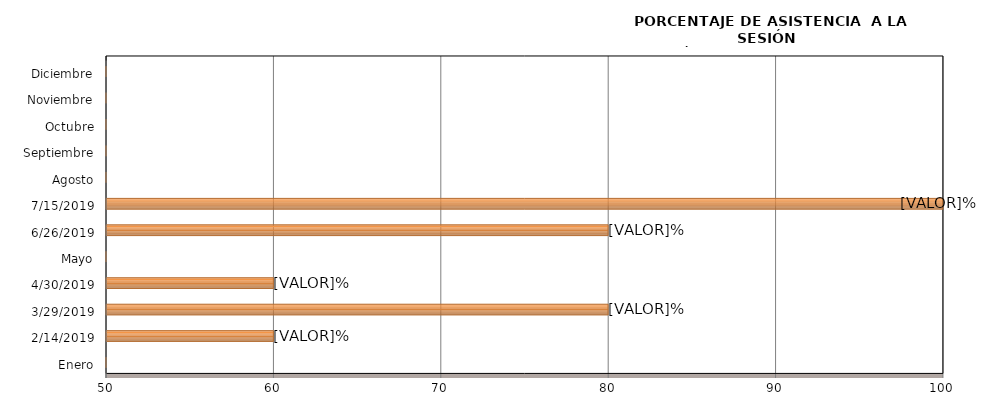
| Category | Series 0 |
|---|---|
| Enero | 0 |
| 14/02/2019 | 60 |
| 29/03/2019 | 80 |
| 30/04/2019 | 60 |
| Mayo | 0 |
| 26/06/2019 | 80 |
| 15/07/2019 | 100 |
| Agosto | 0 |
| Septiembre | 0 |
| Octubre | 0 |
| Noviembre | 0 |
| Diciembre | 0 |